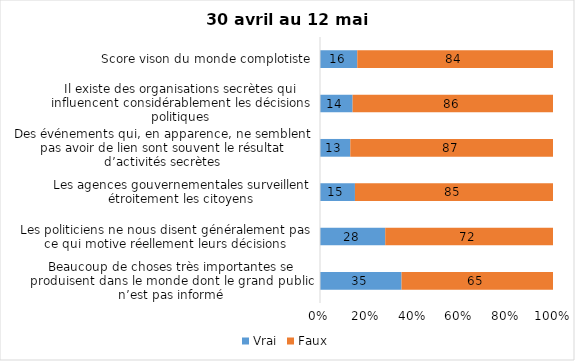
| Category | Vrai | Faux |
|---|---|---|
| Beaucoup de choses très importantes se produisent dans le monde dont le grand public n’est pas informé | 35 | 65 |
| Les politiciens ne nous disent généralement pas ce qui motive réellement leurs décisions | 28 | 72 |
| Les agences gouvernementales surveillent étroitement les citoyens | 15 | 85 |
| Des événements qui, en apparence, ne semblent pas avoir de lien sont souvent le résultat d’activités secrètes | 13 | 87 |
| Il existe des organisations secrètes qui influencent considérablement les décisions politiques | 14 | 86 |
| Score vison du monde complotiste | 16 | 84 |